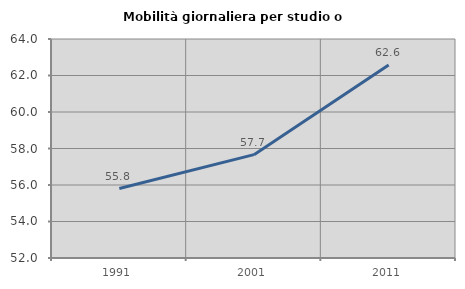
| Category | Mobilità giornaliera per studio o lavoro |
|---|---|
| 1991.0 | 55.808 |
| 2001.0 | 57.662 |
| 2011.0 | 62.578 |